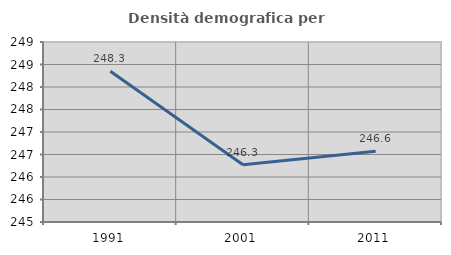
| Category | Densità demografica |
|---|---|
| 1991.0 | 248.348 |
| 2001.0 | 246.273 |
| 2011.0 | 246.57 |